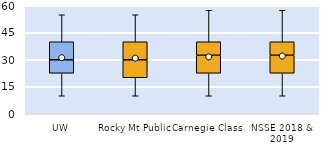
| Category | 25th | 50th | 75th |
|---|---|---|---|
| UW | 22.5 | 7.5 | 10 |
| Rocky Mt Public | 20 | 10 | 10 |
| Carnegie Class | 22.5 | 10 | 7.5 |
| NSSE 2018 & 2019 | 22.5 | 10 | 7.5 |